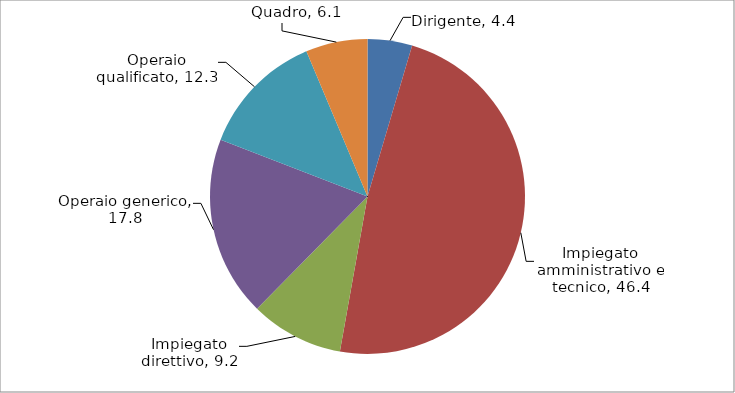
| Category | Series 0 |
|---|---|
| Dirigente | 4.4 |
| Impiegato amministrativo e tecnico | 46.4 |
| Impiegato direttivo | 9.2 |
| Operaio generico | 17.8 |
| Operaio qualificato | 12.3 |
| Quadro | 6.1 |